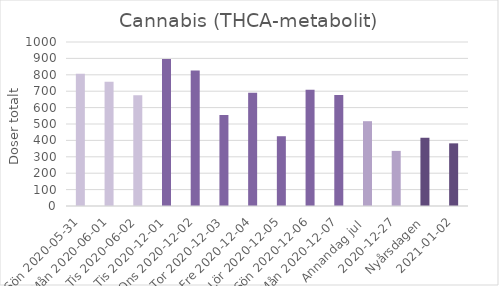
| Category | Cannabis (THCA-metabolit) |
|---|---|
| Sön 2020-05-31 | 806.5 |
| Mån 2020-06-01 | 757.4 |
|  Tis 2020-06-02 | 676 |
| Tis 2020-12-01 | 895.7 |
| Ons 2020-12-02 | 826 |
| Tor 2020-12-03 | 555.6 |
| Fre 2020-12-04 | 690.9 |
| Lör 2020-12-05 | 425.4 |
| Sön 2020-12-06 | 708.1 |
| Mån 2020-12-07 | 677 |
| Annandag jul  | 517.1 |
| 2020-12-27 | 336.1 |
| Nyårsdagen | 416.1 |
| 2021-01-02 | 382 |